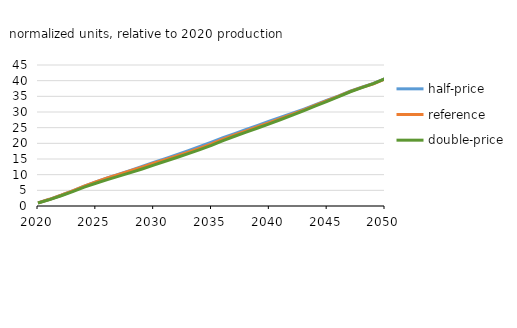
| Category | half-price | reference | double-price |
|---|---|---|---|
| 2020 | 1 | 1 | 0.965 |
| 2021 | 2.139 | 2.139 | 2.052 |
| 2022 | 3.425 | 3.426 | 3.278 |
| 2023 | 4.845 | 4.846 | 4.615 |
| 2024 | 6.349 | 6.351 | 6.022 |
| 2025 | 7.69 | 7.687 | 7.261 |
| 2026 | 8.953 | 8.93 | 8.41 |
| 2027 | 10.167 | 10.102 | 9.521 |
| 2028 | 11.355 | 11.231 | 10.638 |
| 2029 | 12.595 | 12.411 | 11.817 |
| 2030 | 13.893 | 13.63 | 13.054 |
| 2031 | 15.145 | 14.804 | 14.284 |
| 2032 | 16.38 | 15.962 | 15.485 |
| 2033 | 17.659 | 17.167 | 16.698 |
| 2034 | 18.986 | 18.457 | 17.978 |
| 2035 | 20.379 | 19.832 | 19.336 |
| 2036 | 21.795 | 21.306 | 20.853 |
| 2037 | 23.12 | 22.678 | 22.263 |
| 2038 | 24.425 | 23.992 | 23.587 |
| 2039 | 25.716 | 25.296 | 24.89 |
| 2040 | 27.036 | 26.627 | 26.219 |
| 2041 | 28.315 | 27.942 | 27.598 |
| 2042 | 29.591 | 29.299 | 29.018 |
| 2043 | 30.943 | 30.698 | 30.462 |
| 2044 | 32.366 | 32.162 | 31.944 |
| 2045 | 33.79 | 33.629 | 33.416 |
| 2046 | 35.176 | 35.047 | 34.886 |
| 2047 | 36.685 | 36.576 | 36.463 |
| 2048 | 37.948 | 37.844 | 37.782 |
| 2049 | 39.134 | 39.026 | 39.074 |
| 2050 | 40.631 | 40.514 | 40.661 |